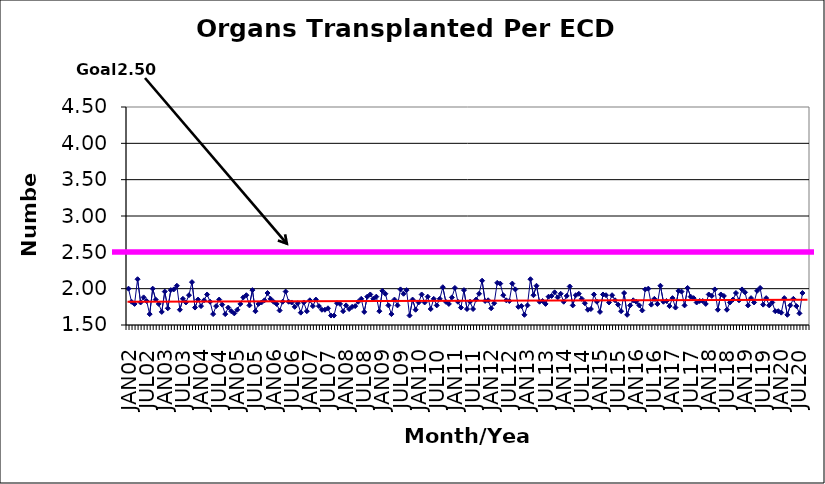
| Category | Series 0 |
|---|---|
| JAN02 | 2 |
| FEB02 | 1.82 |
| MAR02 | 1.79 |
| APR02 | 2.13 |
| MAY02 | 1.81 |
| JUN02 | 1.88 |
| JUL02 | 1.83 |
| AUG02 | 1.65 |
| SEP02 | 2 |
| OCT02 | 1.85 |
| NOV02 | 1.79 |
| DEC02 | 1.68 |
| JAN03 | 1.96 |
| FEB03 | 1.73 |
| MAR03 | 1.98 |
| APR03 | 1.99 |
| MAY03 | 2.04 |
| JUN03 | 1.71 |
| JUL03 | 1.86 |
| AUG03 | 1.81 |
| SEP03 | 1.91 |
| OCT03 | 2.09 |
| NOV03 | 1.74 |
| DEC03 | 1.85 |
| JAN04 | 1.76 |
| FEB04 | 1.84 |
| MAR04 | 1.92 |
| APR04 | 1.82 |
| MAY04 | 1.65 |
| JUN04 | 1.76 |
| JUL04 | 1.85 |
| AUG04 | 1.78 |
| SEP04 | 1.65 |
| OCT04 | 1.74 |
| NOV04 | 1.69 |
| DEC04 | 1.66 |
| JAN05 | 1.71 |
| FEB05 | 1.79 |
| MAR05 | 1.88 |
| APR05 | 1.91 |
| MAY05 | 1.77 |
| JUN05 | 1.98 |
| JUL05 | 1.69 |
| AUG05 | 1.79 |
| SEP05 | 1.81 |
| OCT05 | 1.84 |
| NOV05 | 1.94 |
| DEC05 | 1.86 |
| JAN06 | 1.82 |
| FEB06 | 1.79 |
| MAR06 | 1.7 |
| APR06 | 1.82 |
| MAY06 | 1.96 |
| JUN06 | 1.82 |
| JUL06 | 1.81 |
| AUG06 | 1.75 |
| SEP06 | 1.8 |
| OCT06 | 1.67 |
| NOV06 | 1.81 |
| DEC06 | 1.69 |
| JAN07 | 1.84 |
| FEB07 | 1.76 |
| MAR07 | 1.85 |
| APR07 | 1.76 |
| MAY07 | 1.71 |
| JUN07 | 1.71 |
| JUL07 | 1.73 |
| AUG07 | 1.63 |
| SEP07 | 1.63 |
| OCT07 | 1.8 |
| NOV07 | 1.79 |
| DEC07 | 1.69 |
| JAN08 | 1.77 |
| FEB08 | 1.72 |
| MAR08 | 1.75 |
| APR08 | 1.76 |
| MAY08 | 1.82 |
| JUN08 | 1.86 |
| JUL08 | 1.68 |
| AUG08 | 1.89 |
| SEP08 | 1.92 |
| OCT08 | 1.86 |
| NOV08 | 1.89 |
| DEC08 | 1.69 |
| JAN09 | 1.97 |
| FEB09 | 1.93 |
| MAR09 | 1.77 |
| APR09 | 1.65 |
| MAY09 | 1.85 |
| JUN09 | 1.77 |
| JUL09 | 1.99 |
| AUG09 | 1.93 |
| SEP09 | 1.98 |
| OCT09 | 1.63 |
| NOV09 | 1.85 |
| DEC09 | 1.71 |
| JAN10 | 1.81 |
| FEB10 | 1.92 |
| MAR10 | 1.81 |
| APR10 | 1.89 |
| MAY10 | 1.72 |
| JUN10 | 1.86 |
| JUL10 | 1.77 |
| AUG10 | 1.86 |
| SEP10 | 2.02 |
| OCT10 | 1.82 |
| NOV10 | 1.79 |
| DEC10 | 1.88 |
| JAN11 | 2.01 |
| FEB11 | 1.82 |
| MAR11 | 1.74 |
| APR11 | 1.98 |
| MAY11 | 1.72 |
| JUN11 | 1.82 |
| JUL11 | 1.72 |
| AUG11 | 1.85 |
| SEP11 | 1.93 |
| OCT11 | 2.11 |
| NOV11 | 1.83 |
| DEC11 | 1.84 |
| JAN12 | 1.73 |
| FEB12 | 1.8 |
| MAR12 | 2.08 |
| APR12 | 2.07 |
| MAY12 | 1.91 |
| JUN12 | 1.84 |
| JUL12 | 1.83 |
| AUG12 | 2.07 |
| SEP12 | 1.99 |
| OCT12 | 1.75 |
| NOV12 | 1.76 |
| DEC12 | 1.64 |
| JAN13 | 1.77 |
| FEB13 | 2.13 |
| MAR13 | 1.91 |
| APR13 | 2.04 |
| MAY13 | 1.82 |
| JUN13 | 1.83 |
| JUL13 | 1.79 |
| AUG13 | 1.89 |
| SEP13 | 1.9 |
| OCT13 | 1.95 |
| NOV13 | 1.88 |
| DEC13 | 1.93 |
| JAN14 | 1.82 |
| FEB14 | 1.9 |
| MAR14 | 2.03 |
| APR14 | 1.77 |
| MAY14 | 1.91 |
| JUN14 | 1.93 |
| JUL14 | 1.86 |
| AUG14 | 1.8 |
| SEP14 | 1.71 |
| OCT14 | 1.72 |
| NOV14 | 1.92 |
| DEC14 | 1.82 |
| JAN15 | 1.68 |
| FEB15 | 1.92 |
| MAR15 | 1.91 |
| APR15 | 1.81 |
| MAY15 | 1.91 |
| JUN15 | 1.84 |
| JUL15 | 1.78 |
| AUG15 | 1.69 |
| SEP15 | 1.94 |
| OCT15 | 1.64 |
| NOV15 | 1.77 |
| DEC15 | 1.84 |
| JAN16 | 1.82 |
| FEB16 | 1.77 |
| MAR16 | 1.7 |
| APR16 | 1.99 |
| MAY16 | 2 |
| JUN16 | 1.78 |
| JUL16 | 1.86 |
| AUG16 | 1.79 |
| SEP16 | 2.04 |
| OCT16 | 1.82 |
| NOV16 | 1.83 |
| DEC16 | 1.76 |
| JAN17 | 1.87 |
| FEB17 | 1.74 |
| MAR17 | 1.97 |
| APR17 | 1.96 |
| MAY17 | 1.77 |
| JUN17 | 2.01 |
| JUL17 | 1.89 |
| AUG17 | 1.87 |
| SEP17 | 1.81 |
| OCT17 | 1.83 |
| NOV17 | 1.83 |
| DEC17 | 1.79 |
| JAN18 | 1.92 |
| FEB18 | 1.9 |
| MAR18 | 1.99 |
| APR18 | 1.71 |
| MAY18 | 1.92 |
| JUN18 | 1.9 |
| JUL18 | 1.71 |
| AUG18 | 1.81 |
| SEP18 | 1.85 |
| OCT18 | 1.94 |
| NOV18 | 1.84 |
| DEC18 | 1.99 |
| JAN19 | 1.95 |
| FEB19 | 1.77 |
| MAR19 | 1.87 |
| APR19 | 1.81 |
| MAY19 | 1.97 |
| JUN19 | 2.01 |
| JUL19 | 1.78 |
| AUG19 | 1.87 |
| SEP19 | 1.77 |
| OCT19 | 1.81 |
| NOV19 | 1.69 |
| DEC19 | 1.69 |
| JAN20 | 1.67 |
| FEB20 | 1.87 |
| MAR20 | 1.64 |
| APR20 | 1.77 |
| MAY20 | 1.86 |
| JUN20 | 1.76 |
| JUL20 | 1.66 |
| AUG20 | 1.94 |